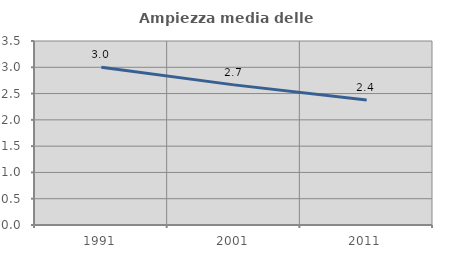
| Category | Ampiezza media delle famiglie |
|---|---|
| 1991.0 | 3.001 |
| 2001.0 | 2.665 |
| 2011.0 | 2.38 |